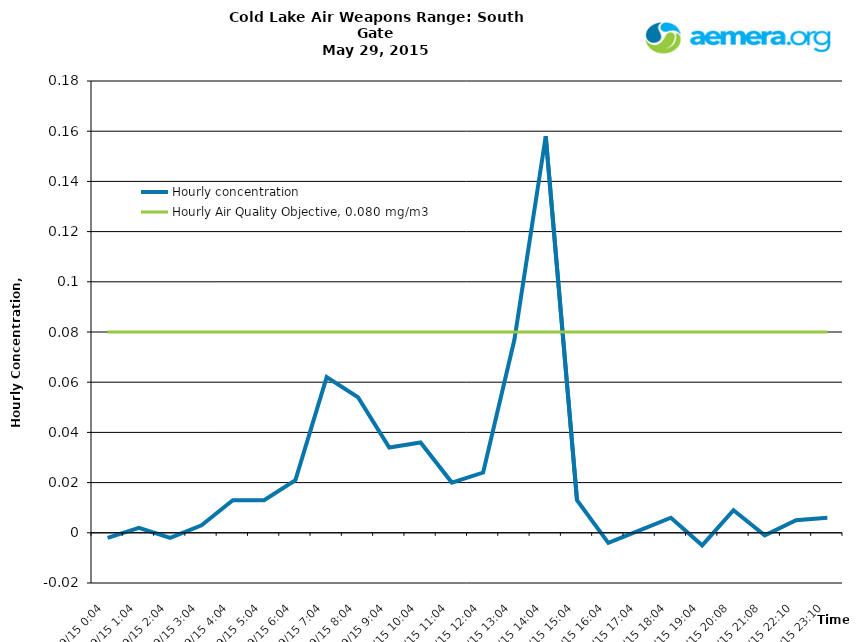
| Category | Hourly concentration | Hourly Air Quality Objective, 0.080 mg/m3 |
|---|---|---|
| 5/29/15 | -0.002 | 0.08 |
| 5/29/15 | 0.002 | 0.08 |
| 5/29/15 | -0.002 | 0.08 |
| 5/29/15 | 0.003 | 0.08 |
| 5/29/15 | 0.013 | 0.08 |
| 5/29/15 | 0.013 | 0.08 |
| 5/29/15 | 0.021 | 0.08 |
| 5/29/15 | 0.062 | 0.08 |
| 5/29/15 | 0.054 | 0.08 |
| 5/29/15 | 0.034 | 0.08 |
| 5/29/15 | 0.036 | 0.08 |
| 5/29/15 | 0.02 | 0.08 |
| 5/29/15 | 0.024 | 0.08 |
| 5/29/15 | 0.077 | 0.08 |
| 5/29/15 | 0.158 | 0.08 |
| 5/29/15 | 0.013 | 0.08 |
| 5/29/15 | -0.004 | 0.08 |
| 5/29/15 | 0.001 | 0.08 |
| 5/29/15 | 0.006 | 0.08 |
| 5/29/15 | -0.005 | 0.08 |
| 5/29/15 | 0.009 | 0.08 |
| 5/29/15 | -0.001 | 0.08 |
| 5/29/15 | 0.005 | 0.08 |
| 5/29/15 | 0.006 | 0.08 |